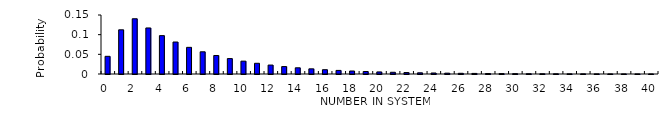
| Category | Series 0 |
|---|---|
| 0.0 | 0.045 |
| 1.0 | 0.112 |
| 2.0 | 0.14 |
| 3.0 | 0.117 |
| 4.0 | 0.098 |
| 5.0 | 0.081 |
| 6.0 | 0.068 |
| 7.0 | 0.056 |
| 8.0 | 0.047 |
| 9.0 | 0.039 |
| 10.0 | 0.033 |
| 11.0 | 0.027 |
| 12.0 | 0.023 |
| 13.0 | 0.019 |
| 14.0 | 0.016 |
| 15.0 | 0.013 |
| 16.0 | 0.011 |
| 17.0 | 0.009 |
| 18.0 | 0.008 |
| 19.0 | 0.006 |
| 20.0 | 0.005 |
| 21.0 | 0.004 |
| 22.0 | 0.004 |
| 23.0 | 0.003 |
| 24.0 | 0.003 |
| 25.0 | 0.002 |
| 26.0 | 0.002 |
| 27.0 | 0.001 |
| 28.0 | 0.001 |
| 29.0 | 0.001 |
| 30.0 | 0.001 |
| 31.0 | 0.001 |
| 32.0 | 0.001 |
| 33.0 | 0 |
| 34.0 | 0 |
| 35.0 | 0 |
| 36.0 | 0 |
| 37.0 | 0 |
| 38.0 | 0 |
| 39.0 | 0 |
| 40.0 | 0 |